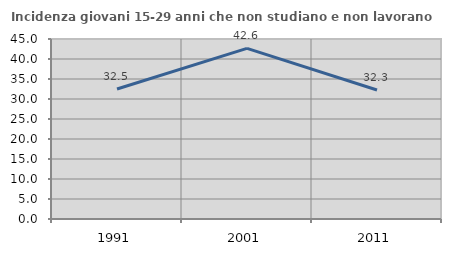
| Category | Incidenza giovani 15-29 anni che non studiano e non lavorano  |
|---|---|
| 1991.0 | 32.495 |
| 2001.0 | 42.64 |
| 2011.0 | 32.261 |